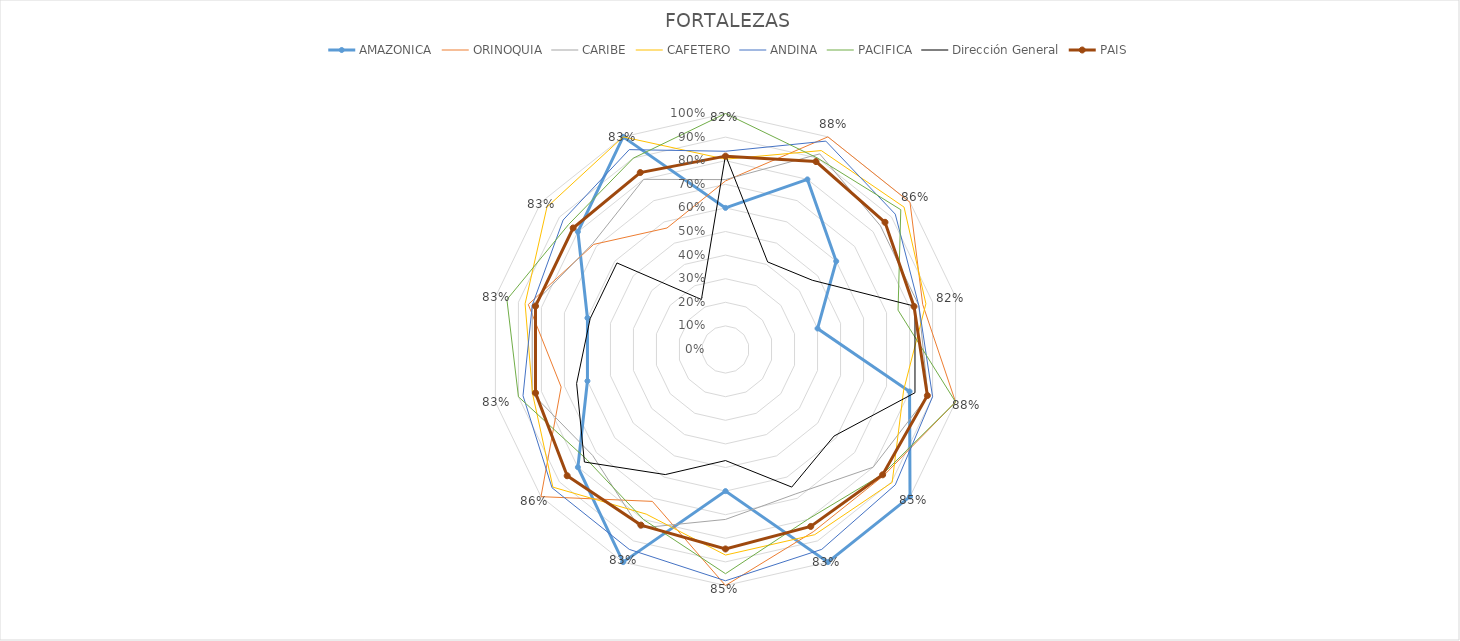
| Category | AMAZONICA | ORINOQUIA | CARIBE | CAFETERO | ANDINA | PACIFICA | Dirección General | PAIS |
|---|---|---|---|---|---|---|---|---|
|  | 0.6 | 0.714 | 0.72 | 0.806 | 0.84 | 1 | 0.824 | 0.819 |
|  | 0.8 | 1 | 0.92 | 0.935 | 0.98 | 0.9 | 0.412 | 0.884 |
|  | 0.6 | 1 | 0.84 | 0.968 | 0.92 | 0.95 | 0.471 | 0.865 |
|  | 0.4 | 0.857 | 0.84 | 0.871 | 0.84 | 0.75 | 0.824 | 0.819 |
|  | 0.8 | 1 | 0.88 | 0.774 | 0.9 | 1 | 0.824 | 0.877 |
|  | 1 | 0.857 | 0.8 | 0.903 | 0.92 | 0.85 | 0.588 | 0.852 |
|  | 1 | 0.857 | 0.68 | 0.871 | 0.94 | 0.8 | 0.647 | 0.832 |
|  | 0.6 | 1 | 0.72 | 0.871 | 0.98 | 0.95 | 0.471 | 0.845 |
|  | 1 | 0.714 | 0.84 | 0.774 | 0.94 | 0.8 | 0.588 | 0.826 |
|  | 0.8 | 1 | 0.72 | 0.935 | 0.94 | 0.75 | 0.765 | 0.858 |
|  | 0.6 | 0.714 | 0.84 | 0.839 | 0.88 | 0.9 | 0.647 | 0.826 |
|  | 0.6 | 0.857 | 0.84 | 0.871 | 0.84 | 0.95 | 0.588 | 0.826 |
|  | 0.8 | 0.714 | 0.72 | 0.968 | 0.88 | 0.85 | 0.588 | 0.826 |
|  | 1 | 0.571 | 0.8 | 1 | 0.94 | 0.9 | 0.235 | 0.832 |